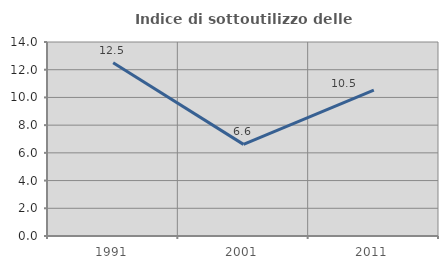
| Category | Indice di sottoutilizzo delle abitazioni  |
|---|---|
| 1991.0 | 12.5 |
| 2001.0 | 6.612 |
| 2011.0 | 10.526 |